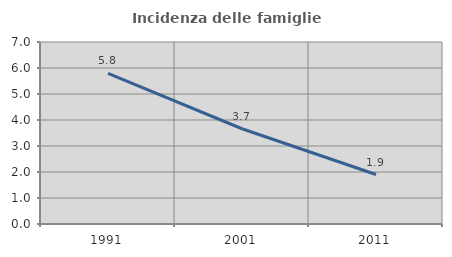
| Category | Incidenza delle famiglie numerose |
|---|---|
| 1991.0 | 5.797 |
| 2001.0 | 3.664 |
| 2011.0 | 1.902 |